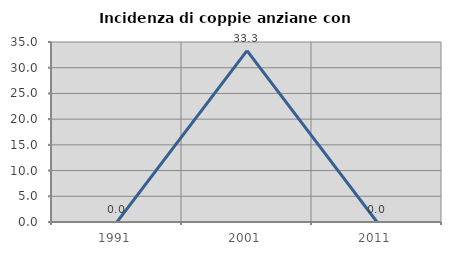
| Category | Incidenza di coppie anziane con figli |
|---|---|
| 1991.0 | 0 |
| 2001.0 | 33.333 |
| 2011.0 | 0 |